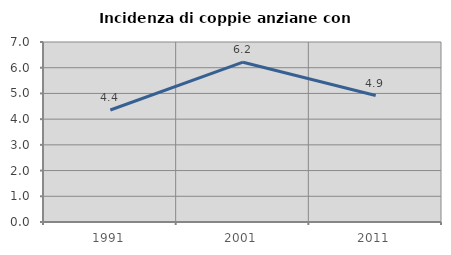
| Category | Incidenza di coppie anziane con figli |
|---|---|
| 1991.0 | 4.356 |
| 2001.0 | 6.215 |
| 2011.0 | 4.918 |